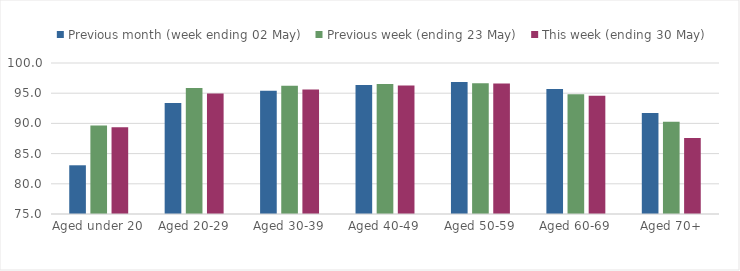
| Category | Previous month (week ending 02 May) | Previous week (ending 23 May) | This week (ending 30 May) |
|---|---|---|---|
| Aged under 20 | 83.066 | 89.667 | 89.374 |
| Aged 20-29 | 93.383 | 95.85 | 94.946 |
| Aged 30-39 | 95.414 | 96.218 | 95.619 |
| Aged 40-49 | 96.341 | 96.517 | 96.285 |
| Aged 50-59 | 96.844 | 96.652 | 96.595 |
| Aged 60-69 | 95.686 | 94.834 | 94.563 |
| Aged 70+ | 91.731 | 90.283 | 87.599 |